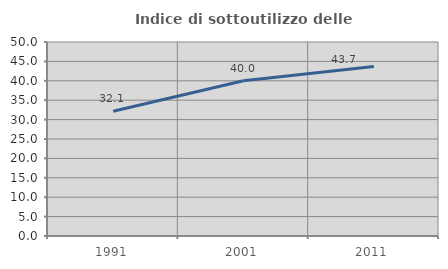
| Category | Indice di sottoutilizzo delle abitazioni  |
|---|---|
| 1991.0 | 32.133 |
| 2001.0 | 40.028 |
| 2011.0 | 43.664 |